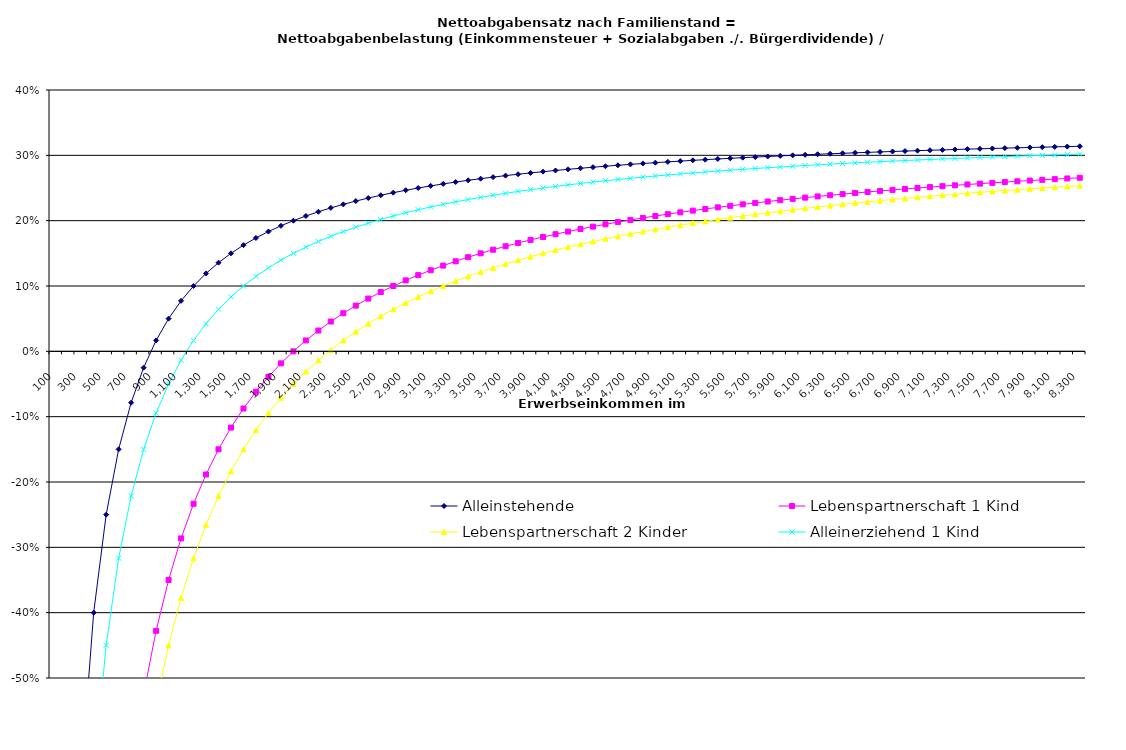
| Category | Alleinstehende | Lebenspartnerschaft 1 Kind | Lebenspartnerschaft 2 Kinder | Alleinerziehend 1 Kind |
|---|---|---|---|---|
| 100.0 | -2.65 | -6.65 | -7.65 | -3.65 |
| 200.0 | -1.15 | -3.15 | -3.65 | -1.65 |
| 300.0 | -0.65 | -1.983 | -2.317 | -0.983 |
| 400.0 | -0.4 | -1.4 | -1.65 | -0.65 |
| 500.0 | -0.25 | -1.05 | -1.25 | -0.45 |
| 600.0 | -0.15 | -0.817 | -0.983 | -0.317 |
| 700.0 | -0.079 | -0.65 | -0.793 | -0.221 |
| 800.0 | -0.025 | -0.525 | -0.65 | -0.15 |
| 900.0 | 0.017 | -0.428 | -0.539 | -0.094 |
| 1000.0 | 0.05 | -0.35 | -0.45 | -0.05 |
| 1100.0 | 0.077 | -0.286 | -0.377 | -0.014 |
| 1200.0 | 0.1 | -0.233 | -0.317 | 0.017 |
| 1300.0 | 0.119 | -0.188 | -0.265 | 0.042 |
| 1400.0 | 0.136 | -0.15 | -0.221 | 0.064 |
| 1500.0 | 0.15 | -0.117 | -0.183 | 0.083 |
| 1600.0 | 0.162 | -0.088 | -0.15 | 0.1 |
| 1700.0 | 0.174 | -0.062 | -0.121 | 0.115 |
| 1800.0 | 0.183 | -0.039 | -0.094 | 0.128 |
| 1900.0 | 0.192 | -0.018 | -0.071 | 0.139 |
| 2000.0 | 0.2 | 0 | -0.05 | 0.15 |
| 2100.0 | 0.207 | 0.017 | -0.031 | 0.16 |
| 2200.0 | 0.214 | 0.032 | -0.014 | 0.168 |
| 2300.0 | 0.22 | 0.046 | 0.002 | 0.176 |
| 2400.0 | 0.225 | 0.058 | 0.017 | 0.183 |
| 2500.0 | 0.23 | 0.07 | 0.03 | 0.19 |
| 2600.0 | 0.235 | 0.081 | 0.042 | 0.196 |
| 2700.0 | 0.239 | 0.091 | 0.054 | 0.202 |
| 2800.0 | 0.243 | 0.1 | 0.064 | 0.207 |
| 2900.0 | 0.247 | 0.109 | 0.074 | 0.212 |
| 3000.0 | 0.25 | 0.117 | 0.083 | 0.217 |
| 3100.0 | 0.253 | 0.124 | 0.092 | 0.221 |
| 3200.0 | 0.256 | 0.131 | 0.1 | 0.225 |
| 3300.0 | 0.259 | 0.138 | 0.108 | 0.229 |
| 3400.0 | 0.262 | 0.144 | 0.115 | 0.232 |
| 3500.0 | 0.264 | 0.15 | 0.121 | 0.236 |
| 3600.0 | 0.267 | 0.156 | 0.128 | 0.239 |
| 3700.0 | 0.269 | 0.161 | 0.134 | 0.242 |
| 3800.0 | 0.271 | 0.166 | 0.139 | 0.245 |
| 3900.0 | 0.273 | 0.171 | 0.145 | 0.247 |
| 4000.0 | 0.275 | 0.175 | 0.15 | 0.25 |
| 4100.0 | 0.277 | 0.179 | 0.155 | 0.252 |
| 4200.0 | 0.279 | 0.183 | 0.16 | 0.255 |
| 4300.0 | 0.28 | 0.187 | 0.164 | 0.257 |
| 4400.0 | 0.282 | 0.191 | 0.168 | 0.259 |
| 4500.0 | 0.283 | 0.194 | 0.172 | 0.261 |
| 4600.0 | 0.285 | 0.198 | 0.176 | 0.263 |
| 4700.0 | 0.286 | 0.201 | 0.18 | 0.265 |
| 4800.0 | 0.288 | 0.204 | 0.183 | 0.267 |
| 4900.0 | 0.289 | 0.207 | 0.187 | 0.268 |
| 5000.0 | 0.29 | 0.21 | 0.19 | 0.27 |
| 5100.0 | 0.291 | 0.213 | 0.193 | 0.272 |
| 5200.0 | 0.292 | 0.215 | 0.196 | 0.273 |
| 5300.0 | 0.293 | 0.218 | 0.199 | 0.275 |
| 5400.0 | 0.294 | 0.22 | 0.202 | 0.276 |
| 5500.0 | 0.295 | 0.223 | 0.205 | 0.277 |
| 5600.0 | 0.296 | 0.225 | 0.207 | 0.279 |
| 5700.0 | 0.297 | 0.227 | 0.21 | 0.28 |
| 5800.0 | 0.298 | 0.229 | 0.212 | 0.281 |
| 5900.0 | 0.299 | 0.231 | 0.214 | 0.282 |
| 6000.0 | 0.3 | 0.233 | 0.217 | 0.283 |
| 6100.0 | 0.301 | 0.235 | 0.219 | 0.284 |
| 6200.0 | 0.302 | 0.237 | 0.221 | 0.285 |
| 6300.0 | 0.302 | 0.239 | 0.223 | 0.287 |
| 6400.0 | 0.303 | 0.241 | 0.225 | 0.288 |
| 6500.0 | 0.304 | 0.242 | 0.227 | 0.288 |
| 6600.0 | 0.305 | 0.244 | 0.229 | 0.289 |
| 6700.0 | 0.305 | 0.246 | 0.231 | 0.29 |
| 6800.0 | 0.306 | 0.247 | 0.232 | 0.291 |
| 6900.0 | 0.307 | 0.249 | 0.234 | 0.292 |
| 7000.0 | 0.307 | 0.25 | 0.236 | 0.293 |
| 7100.0 | 0.308 | 0.251 | 0.237 | 0.294 |
| 7200.0 | 0.308 | 0.253 | 0.239 | 0.294 |
| 7300.0 | 0.309 | 0.254 | 0.24 | 0.295 |
| 7400.0 | 0.309 | 0.255 | 0.242 | 0.296 |
| 7500.0 | 0.31 | 0.257 | 0.243 | 0.297 |
| 7600.0 | 0.311 | 0.258 | 0.245 | 0.297 |
| 7700.0 | 0.311 | 0.259 | 0.246 | 0.298 |
| 7800.0 | 0.312 | 0.26 | 0.247 | 0.299 |
| 7900.0 | 0.312 | 0.261 | 0.249 | 0.299 |
| 8000.0 | 0.312 | 0.262 | 0.25 | 0.3 |
| 8100.0 | 0.313 | 0.264 | 0.251 | 0.301 |
| 8200.0 | 0.313 | 0.265 | 0.252 | 0.301 |
| 8300.0 | 0.314 | 0.266 | 0.254 | 0.302 |